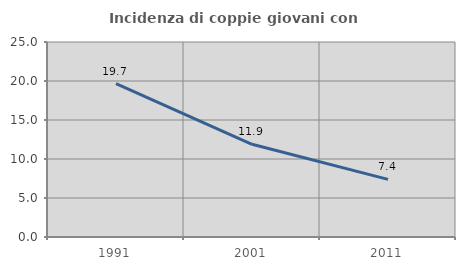
| Category | Incidenza di coppie giovani con figli |
|---|---|
| 1991.0 | 19.663 |
| 2001.0 | 11.881 |
| 2011.0 | 7.391 |